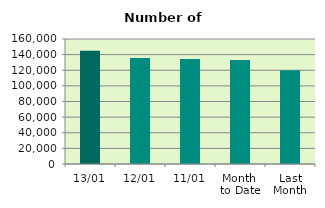
| Category | Series 0 |
|---|---|
| 13/01 | 145056 |
| 12/01 | 135760 |
| 11/01 | 134248 |
| Month 
to Date | 133160.444 |
| Last
Month | 120108.783 |